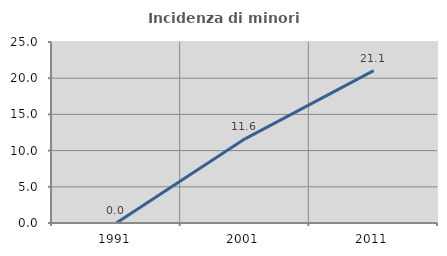
| Category | Incidenza di minori stranieri |
|---|---|
| 1991.0 | 0 |
| 2001.0 | 11.628 |
| 2011.0 | 21.053 |